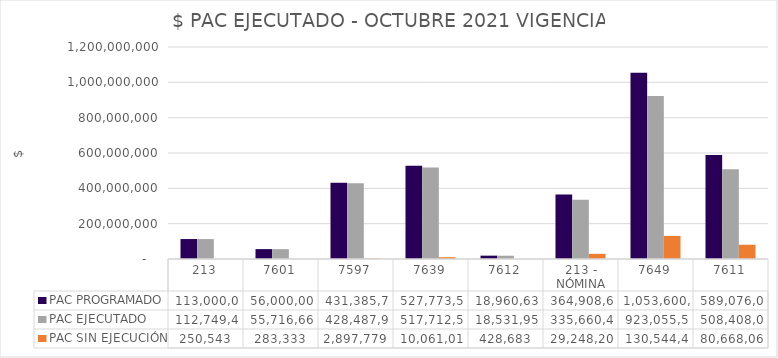
| Category | PAC PROGRAMADO | PAC EJECUTADO | PAC SIN EJECUCIÓN |
|---|---|---|---|
| 213 | 113000000 | 112749457 | 250543 |
| 7601 | 56000000 | 55716667 | 283333 |
| 7597 | 431385711 | 428487932 | 2897779 |
| 7639 | 527773567 | 517712555 | 10061012 |
| 7612 | 18960638 | 18531955 | 428683 |
| 213 - NÓMINA | 364908621 | 335660414 | 29248207 |
| 7649 | 1053600000 | 923055548 | 130544452 |
| 7611 | 589076067 | 508408006 | 80668061 |